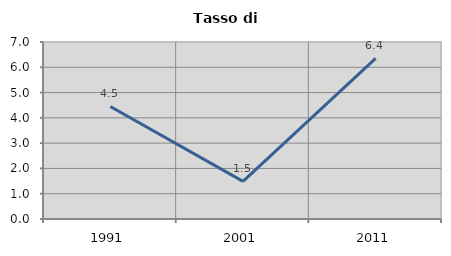
| Category | Tasso di disoccupazione   |
|---|---|
| 1991.0 | 4.451 |
| 2001.0 | 1.488 |
| 2011.0 | 6.355 |